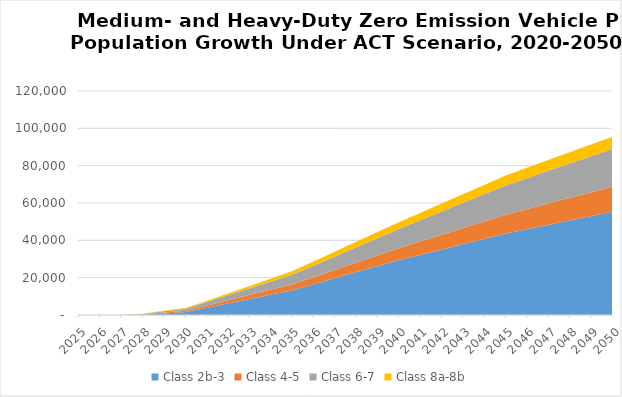
| Category | Class 2b-3 | Class 4-5 | Class 6-7 | Class 8a-8b |
|---|---|---|---|---|
| 2025.0 | 0 | 0 | 0 | 0 |
| 2026.0 | 0 | 0 | 0 | 0 |
| 2027.0 | 0 | 15.932 | 24.412 | 10.384 |
| 2028.0 | 184.652 | 151.125 | 244.635 | 103.892 |
| 2029.0 | 817.123 | 460.127 | 746.114 | 413.824 |
| 2030.0 | 1600 | 670 | 1080 | 350 |
| 2031.0 | 3938 | 1176 | 1892 | 658 |
| 2032.0 | 6276 | 1682 | 2704 | 966 |
| 2033.0 | 8614 | 2188 | 3516 | 1274 |
| 2034.0 | 10952 | 2694 | 4328 | 1582 |
| 2035.0 | 13290 | 3200 | 5140 | 1890 |
| 2036.0 | 16526 | 3848 | 6168 | 2244 |
| 2037.0 | 19762 | 4496 | 7196 | 2598 |
| 2038.0 | 22998 | 5144 | 8224 | 2952 |
| 2039.0 | 26234 | 5792 | 9252 | 3306 |
| 2040.0 | 29470 | 6440 | 10280 | 3660 |
| 2041.0 | 32312 | 7180 | 11370 | 3980 |
| 2042.0 | 35154 | 7920 | 12460 | 4300 |
| 2043.0 | 37996 | 8660 | 13550 | 4620 |
| 2044.0 | 40838 | 9400 | 14640 | 4940 |
| 2045.0 | 43680 | 10140 | 15730 | 5260 |
| 2046.0 | 46034 | 10786 | 16638 | 5508 |
| 2047.0 | 48388 | 11432 | 17546 | 5756 |
| 2048.0 | 50742 | 12078 | 18454 | 6004 |
| 2049.0 | 53096 | 12724 | 19362 | 6252 |
| 2050.0 | 55450 | 13370 | 20270 | 6500 |